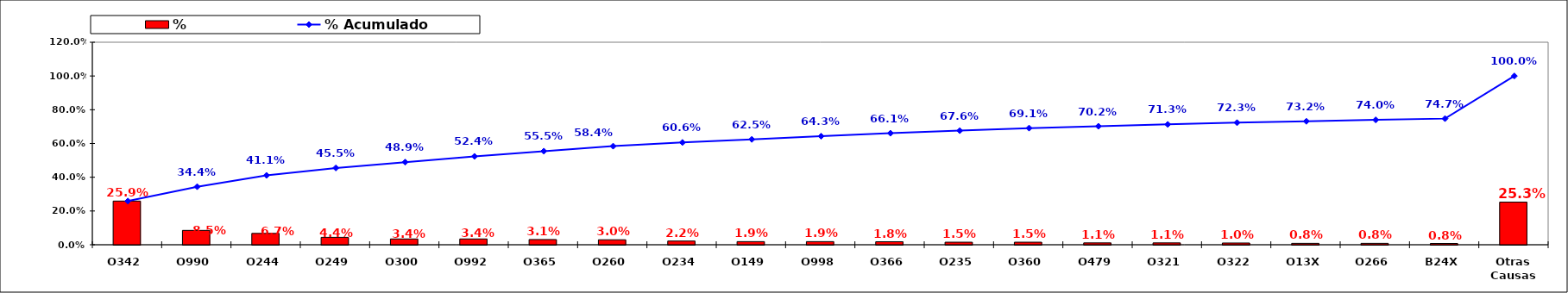
| Category | % |
|---|---|
| O342 | 0.259 |
| O990 | 0.085 |
| O244 | 0.067 |
| O249 | 0.044 |
| O300 | 0.034 |
| O992 | 0.034 |
| O365 | 0.031 |
| O260 | 0.03 |
| O234 | 0.022 |
| O149 | 0.019 |
| O998 | 0.019 |
| O366 | 0.018 |
| O235 | 0.015 |
| O360 | 0.015 |
| O479 | 0.011 |
| O321 | 0.011 |
| O322 | 0.01 |
| O13X | 0.008 |
| O266 | 0.008 |
| B24X | 0.008 |
| Otras Causas | 0.253 |